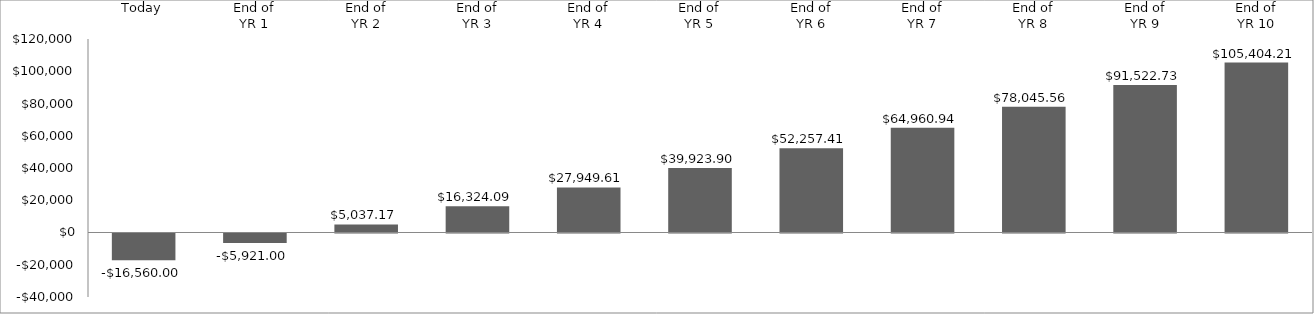
| Category | Annual Cash Flow |
|---|---|
| Today | -16560 |
| End of
YR 1 | -5921 |
| End of
YR 2 | 5037.17 |
| End of
YR 3 | 16324.085 |
| End of
YR 4 | 27949.608 |
| End of
YR 5 | 39923.896 |
| End of
YR 6 | 52257.413 |
| End of
YR 7 | 64960.935 |
| End of
YR 8 | 78045.563 |
| End of
YR 9 | 91522.73 |
| End of
YR 10 | 105404.212 |